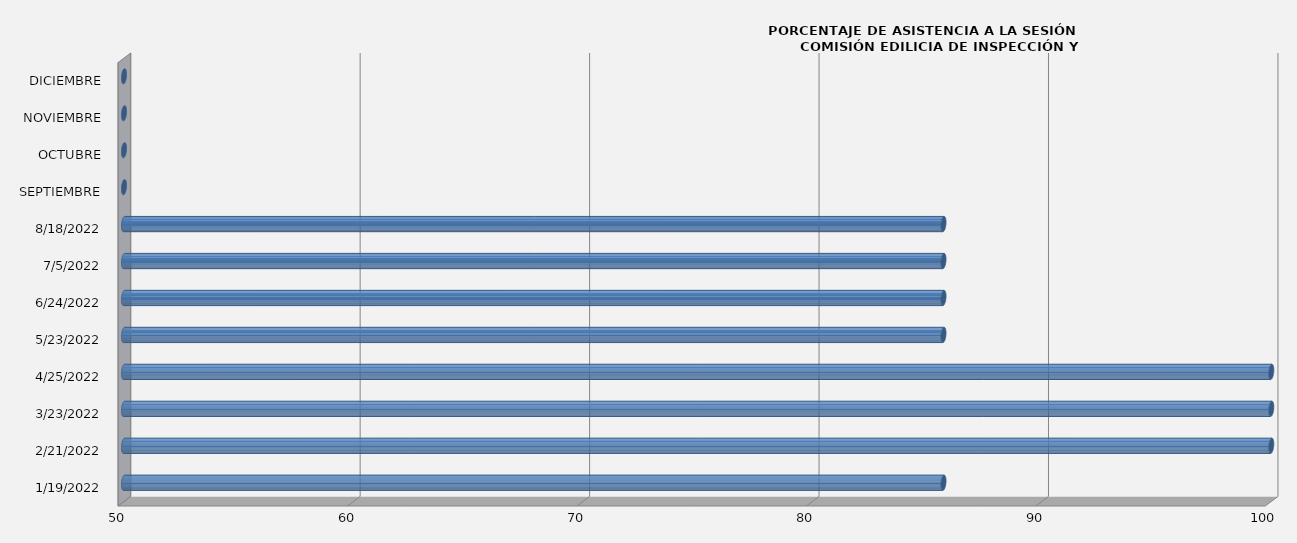
| Category | Series 0 |
|---|---|
| 19/01/2022 | 85.714 |
| 21/02/2022 | 100 |
| 23/03/2022 | 100 |
| 25/04/2022 | 100 |
| 23/05/2022 | 85.714 |
| 24/06/2022 | 85.714 |
| 05/07/2022 | 85.714 |
| 18/08/2022 | 85.714 |
| SEPTIEMBRE | 0 |
| OCTUBRE | 0 |
| NOVIEMBRE | 0 |
| DICIEMBRE | 0 |